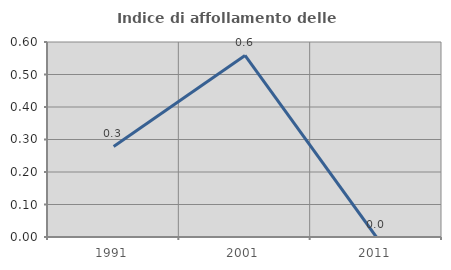
| Category | Indice di affollamento delle abitazioni  |
|---|---|
| 1991.0 | 0.279 |
| 2001.0 | 0.559 |
| 2011.0 | 0 |